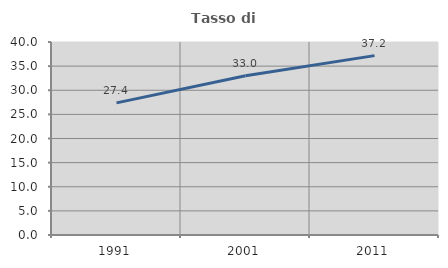
| Category | Tasso di occupazione   |
|---|---|
| 1991.0 | 27.38 |
| 2001.0 | 33.012 |
| 2011.0 | 37.173 |